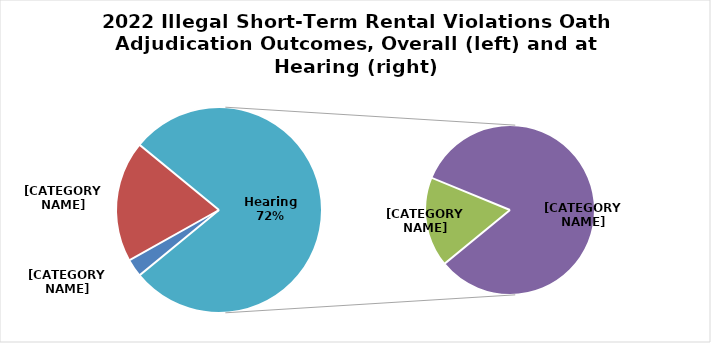
| Category | Series 0 |
|---|---|
| Cure/Admit | 32 |
| Default | 218 |
| Dismissed | 153 |
| In Violation | 739 |